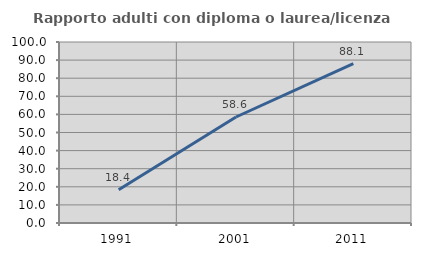
| Category | Rapporto adulti con diploma o laurea/licenza media  |
|---|---|
| 1991.0 | 18.415 |
| 2001.0 | 58.567 |
| 2011.0 | 88.077 |